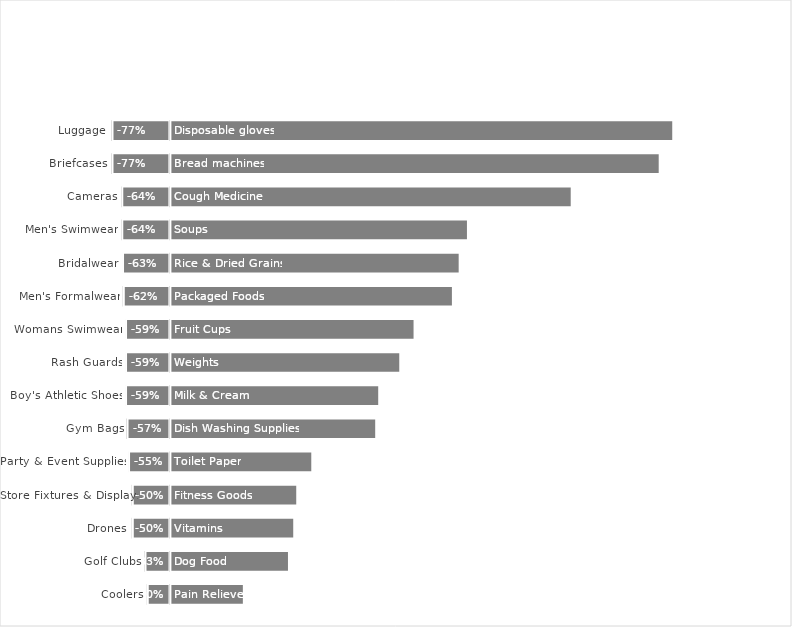
| Category | Rückgang | Zuwachs | Position vor Corona | Position nach Corona |
|---|---|---|---|---|
| 0 | -0.77 | 6.7 | -0.77 | 0 |
| 1 | -0.77 | 6.52 | -0.77 | 0 |
| 2 | -0.64 | 5.35 | -0.64 | 0 |
| 3 | -0.64 | 3.97 | -0.64 | 0 |
| 4 | -0.63 | 3.86 | -0.63 | 0 |
| 5 | -0.62 | 3.77 | -0.62 | 0 |
| 6 | -0.59 | 3.26 | -0.59 | 0 |
| 7 | -0.59 | 3.07 | -0.59 | 0 |
| 8 | -0.59 | 2.79 | -0.59 | 0 |
| 9 | -0.57 | 2.75 | -0.57 | 0 |
| 10 | -0.55 | 1.9 | -0.55 | 0 |
| 11 | -0.5 | 1.7 | -0.5 | 0 |
| 12 | -0.5 | 1.66 | -0.5 | 0 |
| 13 | -0.33 | 1.59 | -0.33 | 0 |
| 14 | -0.3 | 0.99 | -0.3 | 0 |